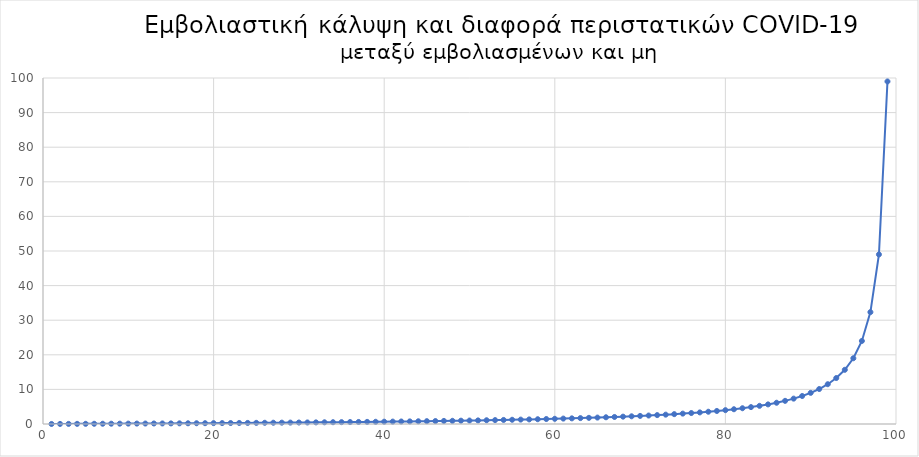
| Category | Διαφορά (φορές) |
|---|---|
| 1.0 | 0.01 |
| 2.0 | 0.02 |
| 3.0 | 0.031 |
| 4.0 | 0.042 |
| 5.0 | 0.053 |
| 6.0 | 0.064 |
| 7.0 | 0.075 |
| 8.0 | 0.087 |
| 9.0 | 0.099 |
| 10.0 | 0.111 |
| 11.0 | 0.124 |
| 12.0 | 0.136 |
| 13.0 | 0.149 |
| 14.0 | 0.163 |
| 15.0 | 0.176 |
| 16.0 | 0.19 |
| 17.0 | 0.205 |
| 18.0 | 0.22 |
| 19.0 | 0.235 |
| 20.0 | 0.25 |
| 21.0 | 0.266 |
| 22.0 | 0.282 |
| 23.0 | 0.299 |
| 24.0 | 0.316 |
| 25.0 | 0.333 |
| 26.0 | 0.351 |
| 27.0 | 0.37 |
| 28.0 | 0.389 |
| 29.0 | 0.408 |
| 30.0 | 0.429 |
| 31.0 | 0.449 |
| 32.0 | 0.471 |
| 33.0 | 0.493 |
| 34.0 | 0.515 |
| 35.0 | 0.538 |
| 36.0 | 0.562 |
| 37.0 | 0.587 |
| 38.0 | 0.613 |
| 39.0 | 0.639 |
| 40.0 | 0.667 |
| 41.0 | 0.695 |
| 42.0 | 0.724 |
| 43.0 | 0.754 |
| 44.0 | 0.786 |
| 45.0 | 0.818 |
| 46.0 | 0.852 |
| 47.0 | 0.887 |
| 48.0 | 0.923 |
| 49.0 | 0.961 |
| 50.0 | 1 |
| 51.0 | 1.041 |
| 52.0 | 1.083 |
| 53.0 | 1.128 |
| 54.0 | 1.174 |
| 55.0 | 1.222 |
| 56.0 | 1.273 |
| 57.0 | 1.326 |
| 58.0 | 1.381 |
| 59.0 | 1.439 |
| 60.0 | 1.5 |
| 61.0 | 1.564 |
| 62.0 | 1.632 |
| 63.0 | 1.703 |
| 64.0 | 1.778 |
| 65.0 | 1.857 |
| 66.0 | 1.941 |
| 67.0 | 2.03 |
| 68.0 | 2.125 |
| 69.0 | 2.226 |
| 70.0 | 2.333 |
| 71.0 | 2.448 |
| 72.0 | 2.571 |
| 73.0 | 2.704 |
| 74.0 | 2.846 |
| 75.0 | 3 |
| 76.0 | 3.167 |
| 77.0 | 3.348 |
| 78.0 | 3.545 |
| 79.0 | 3.762 |
| 80.0 | 4 |
| 81.0 | 4.263 |
| 82.0 | 4.556 |
| 83.0 | 4.882 |
| 84.0 | 5.25 |
| 85.0 | 5.667 |
| 86.0 | 6.143 |
| 87.0 | 6.692 |
| 88.0 | 7.333 |
| 89.0 | 8.091 |
| 90.0 | 9 |
| 91.0 | 10.111 |
| 92.0 | 11.5 |
| 93.0 | 13.286 |
| 94.0 | 15.667 |
| 95.0 | 19 |
| 96.0 | 24 |
| 97.0 | 32.333 |
| 98.0 | 49 |
| 99.0 | 99 |